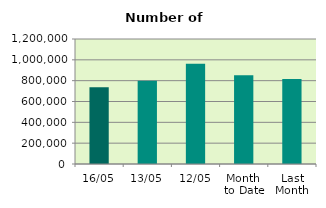
| Category | Series 0 |
|---|---|
| 16/05 | 737764 |
| 13/05 | 799582 |
| 12/05 | 963230 |
| Month 
to Date | 850874 |
| Last
Month | 814883.684 |